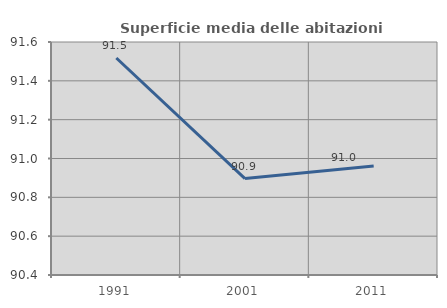
| Category | Superficie media delle abitazioni occupate |
|---|---|
| 1991.0 | 91.518 |
| 2001.0 | 90.897 |
| 2011.0 | 90.962 |